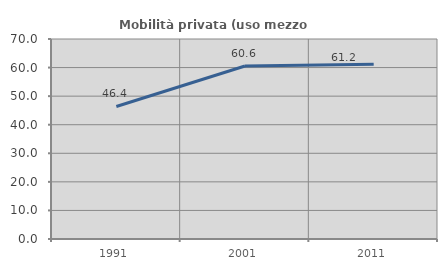
| Category | Mobilità privata (uso mezzo privato) |
|---|---|
| 1991.0 | 46.375 |
| 2001.0 | 60.558 |
| 2011.0 | 61.196 |